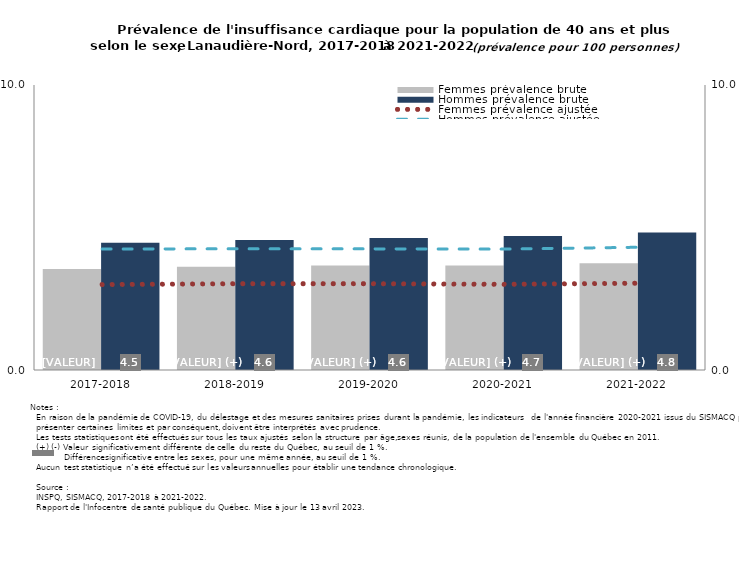
| Category | Femmes prévalence brute | Hommes prévalence brute |
|---|---|---|
| 2017-2018 | 3.54 | 4.468 |
| 2018-2019 | 3.62 | 4.558 |
| 2019-2020 | 3.664 | 4.635 |
| 2020-2021 | 3.669 | 4.7 |
| 2021-2022 | 3.745 | 4.824 |